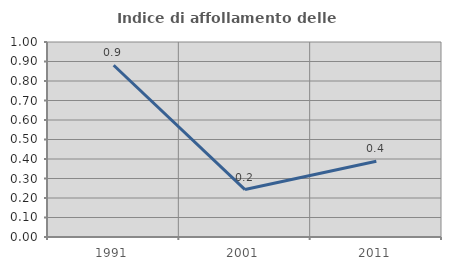
| Category | Indice di affollamento delle abitazioni  |
|---|---|
| 1991.0 | 0.881 |
| 2001.0 | 0.243 |
| 2011.0 | 0.389 |